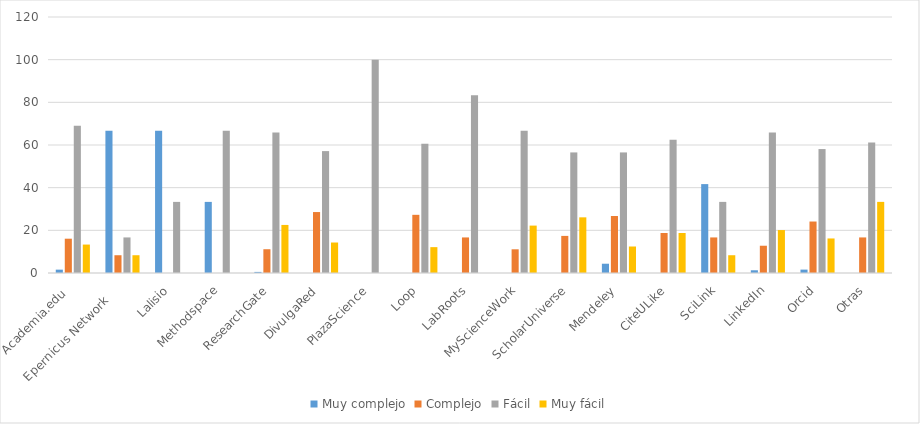
| Category | Muy complejo | Complejo | Fácil | Muy fácil |
|---|---|---|---|---|
| Academia.edu  | 1.57 | 16.08 | 69.02 | 13.33 |
| Epernicus Network     | 66.67 | 8.33 | 16.67 | 8.33 |
| Lalisio | 66.67 | 0 | 33.33 | 0 |
| Methodspace | 33.33 | 0 | 66.67 | 0 |
| ResearchGate | 0.51 | 11.14 | 65.82 | 22.53 |
| DivulgaRed | 0 | 28.57 | 57.14 | 14.29 |
| PlazaScience | 0 | 0 | 100 | 0 |
| Loop | 0 | 27.27 | 60.61 | 12.12 |
| LabRoots | 0 | 16.67 | 83.33 | 0 |
| MyScienceWork | 0 | 11.11 | 66.67 | 22.22 |
| ScholarUniverse | 0 | 17.39 | 56.52 | 26.09 |
| Mendeley | 4.35 | 26.71 | 56.52 | 12.42 |
| CiteULike | 0 | 18.75 | 62.5 | 18.75 |
| SciLink | 41.67 | 16.67 | 33.33 | 8.33 |
| LinkedIn | 1.28 | 12.78 | 65.81 | 20.13 |
| Orcid | 1.59 | 24.13 | 58.1 | 16.19 |
| Otras | 0 | 16.67 | 61.16 | 33.34 |